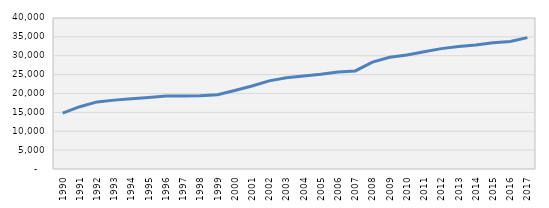
| Category | Series 1 |
|---|---|
| 1990.0 | 14783.28 |
| 1991.0 | 16501.93 |
| 1992.0 | 17768.031 |
| 1993.0 | 18243.964 |
| 1994.0 | 18604.337 |
| 1995.0 | 18924.128 |
| 1996.0 | 19328.054 |
| 1997.0 | 19364.427 |
| 1998.0 | 19378.716 |
| 1999.0 | 19682.633 |
| 2000.0 | 20804.355 |
| 2001.0 | 21989.252 |
| 2002.0 | 23340.846 |
| 2003.0 | 24194.41 |
| 2004.0 | 24608.974 |
| 2005.0 | 25090.47 |
| 2006.0 | 25682.113 |
| 2007.0 | 25980.981 |
| 2008.0 | 28315.165 |
| 2009.0 | 29599.008 |
| 2010.0 | 30196.738 |
| 2011.0 | 31040.261 |
| 2012.0 | 31887.065 |
| 2013.0 | 32472.033 |
| 2014.0 | 32841.413 |
| 2015.0 | 33466.228 |
| 2016.0 | 33799.612 |
| 2017.0 | 34793.557 |